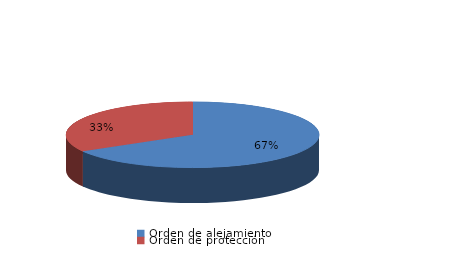
| Category | Series 0 |
|---|---|
| Orden de alejamiento | 4 |
| Orden de protección | 2 |